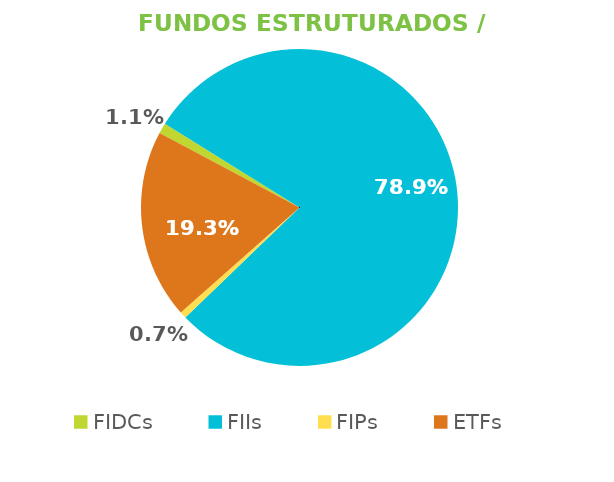
| Category | Fundos Estruturados / ETFs |
|---|---|
| FIDCs | 0.011 |
| FIIs | 0.789 |
| FIPs | 0.007 |
| ETFs | 0.193 |